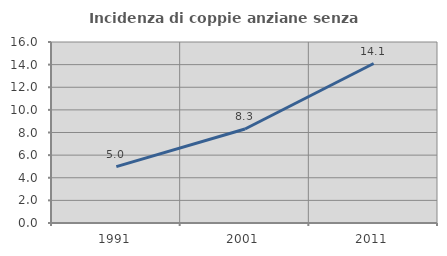
| Category | Incidenza di coppie anziane senza figli  |
|---|---|
| 1991.0 | 4.982 |
| 2001.0 | 8.309 |
| 2011.0 | 14.099 |